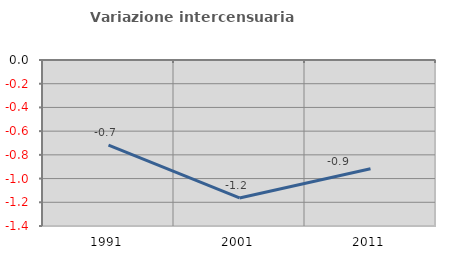
| Category | Variazione intercensuaria annua |
|---|---|
| 1991.0 | -0.719 |
| 2001.0 | -1.163 |
| 2011.0 | -0.917 |